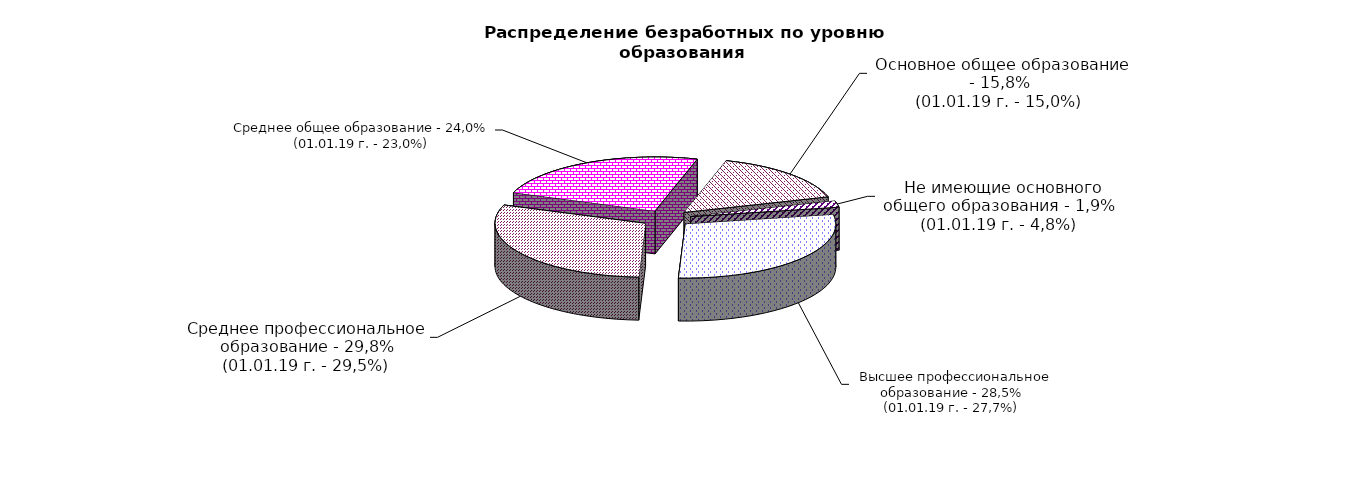
| Category | Series 0 |
|---|---|
|  - высшее профессиональное образование | 28.5 |
|  - среднее профессиональное образование | 29.8 |
|  - среднее общее образование | 24 |
|  - основное общее образование | 15.8 |
|  - не имеющие основного общего образования | 1.9 |